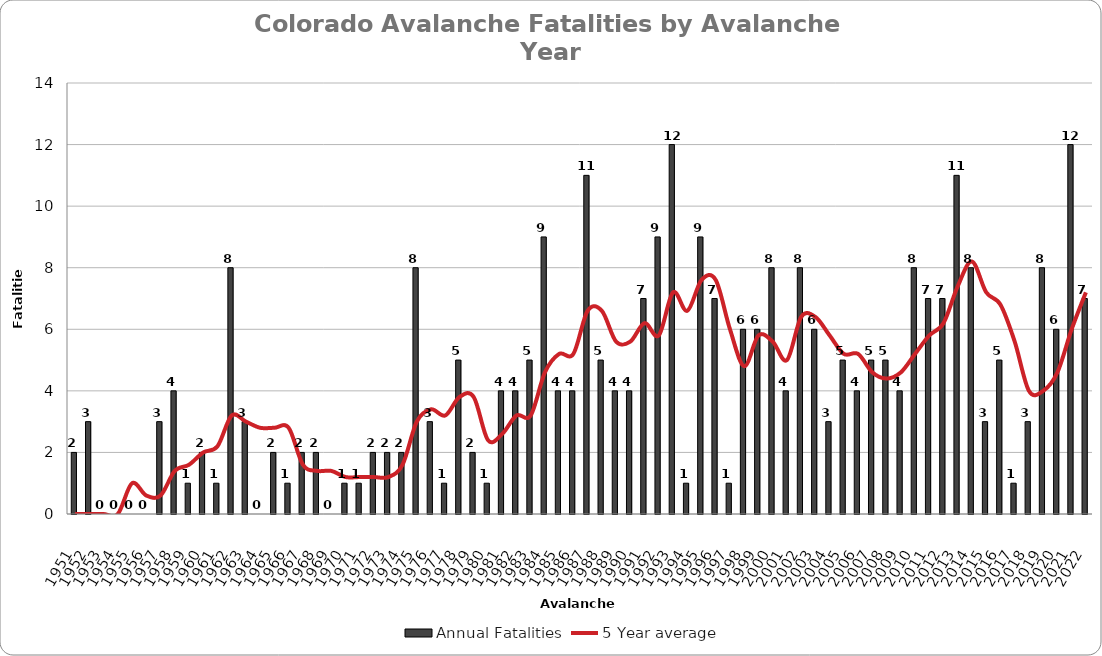
| Category | Annual Fatalities |
|---|---|
| 1951.0 | 2 |
| 1952.0 | 3 |
| 1953.0 | 0 |
| 1954.0 | 0 |
| 1955.0 | 0 |
| 1956.0 | 0 |
| 1957.0 | 3 |
| 1958.0 | 4 |
| 1959.0 | 1 |
| 1960.0 | 2 |
| 1961.0 | 1 |
| 1962.0 | 8 |
| 1963.0 | 3 |
| 1964.0 | 0 |
| 1965.0 | 2 |
| 1966.0 | 1 |
| 1967.0 | 2 |
| 1968.0 | 2 |
| 1969.0 | 0 |
| 1970.0 | 1 |
| 1971.0 | 1 |
| 1972.0 | 2 |
| 1973.0 | 2 |
| 1974.0 | 2 |
| 1975.0 | 8 |
| 1976.0 | 3 |
| 1977.0 | 1 |
| 1978.0 | 5 |
| 1979.0 | 2 |
| 1980.0 | 1 |
| 1981.0 | 4 |
| 1982.0 | 4 |
| 1983.0 | 5 |
| 1984.0 | 9 |
| 1985.0 | 4 |
| 1986.0 | 4 |
| 1987.0 | 11 |
| 1988.0 | 5 |
| 1989.0 | 4 |
| 1990.0 | 4 |
| 1991.0 | 7 |
| 1992.0 | 9 |
| 1993.0 | 12 |
| 1994.0 | 1 |
| 1995.0 | 9 |
| 1996.0 | 7 |
| 1997.0 | 1 |
| 1998.0 | 6 |
| 1999.0 | 6 |
| 2000.0 | 8 |
| 2001.0 | 4 |
| 2002.0 | 8 |
| 2003.0 | 6 |
| 2004.0 | 3 |
| 2005.0 | 5 |
| 2006.0 | 4 |
| 2007.0 | 5 |
| 2008.0 | 5 |
| 2009.0 | 4 |
| 2010.0 | 8 |
| 2011.0 | 7 |
| 2012.0 | 7 |
| 2013.0 | 11 |
| 2014.0 | 8 |
| 2015.0 | 3 |
| 2016.0 | 5 |
| 2017.0 | 1 |
| 2018.0 | 3 |
| 2019.0 | 8 |
| 2020.0 | 6 |
| 2021.0 | 12 |
| 2022.0 | 7 |